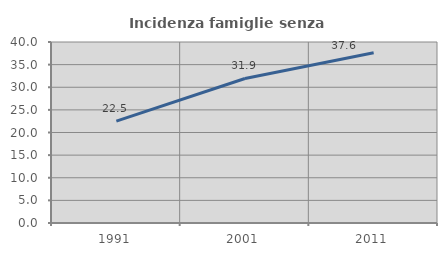
| Category | Incidenza famiglie senza nuclei |
|---|---|
| 1991.0 | 22.523 |
| 2001.0 | 31.939 |
| 2011.0 | 37.627 |